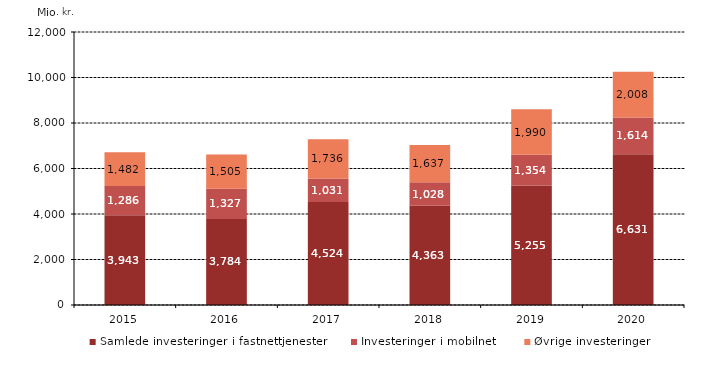
| Category | Samlede investeringer i fastnettjenester | Investeringer i mobilnet | Øvrige investeringer |
|---|---|---|---|
| 2015.0 | 3942.948 | 1286.307 | 1482.137 |
| 2016.0 | 3783.652 | 1326.949 | 1504.618 |
| 2017.0 | 4524.283 | 1030.872 | 1735.837 |
| 2018.0 | 4363.239 | 1028.402 | 1636.992 |
| 2019.0 | 5255.42 | 1353.757 | 1990.352 |
| 2020.0 | 6631 | 1614.284 | 2008.334 |